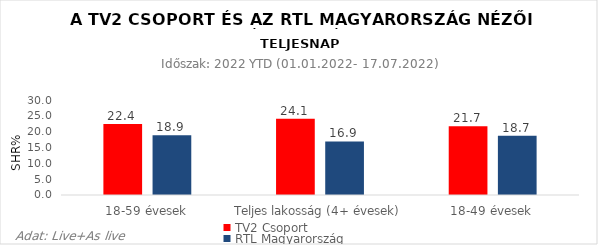
| Category | TV2 Csoport | RTL Magyarország |
|---|---|---|
| 18-59 évesek | 22.4 | 18.9 |
| Teljes lakosság (4+ évesek) | 24.1 | 16.9 |
| 18-49 évesek | 21.7 | 18.7 |